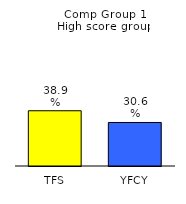
| Category | Series 0 |
|---|---|
| TFS | 0.389 |
| YFCY | 0.306 |